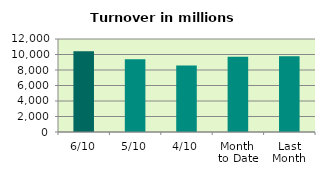
| Category | Series 0 |
|---|---|
| 6/10 | 10428.275 |
| 5/10 | 9374.394 |
| 4/10 | 8585.939 |
| Month 
to Date | 9699.174 |
| Last
Month | 9769.37 |